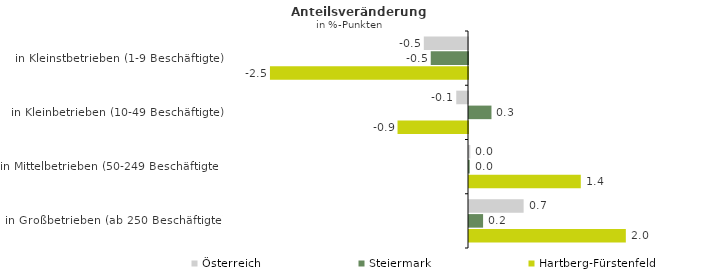
| Category | Österreich | Steiermark | Hartberg-Fürstenfeld |
|---|---|---|---|
| in Kleinstbetrieben (1-9 Beschäftigte) | -0.55 | -0.464 | -2.465 |
| in Kleinbetrieben (10-49 Beschäftigte) | -0.146 | 0.28 | -0.877 |
| in Mittelbetrieben (50-249 Beschäftigte) | 0.016 | 0.009 | 1.392 |
| in Großbetrieben (ab 250 Beschäftigte) | 0.68 | 0.175 | 1.952 |